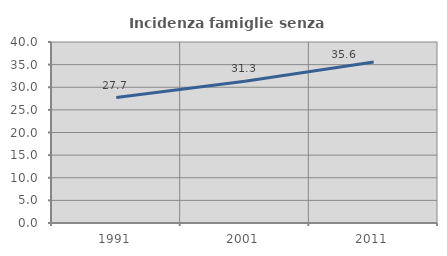
| Category | Incidenza famiglie senza nuclei |
|---|---|
| 1991.0 | 27.723 |
| 2001.0 | 31.343 |
| 2011.0 | 35.597 |